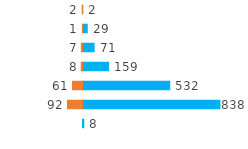
| Category | Series 0 | Series 1 |
|---|---|---|
| 0 | 2 | -2 |
| 1 | 29 | -1 |
| 2 | 71 | -7 |
| 3 | 159 | -8 |
| 4 | 532 | -61 |
| 5 | 838 | -92 |
| 6 | 8 | 0 |